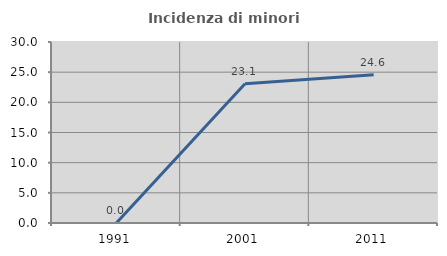
| Category | Incidenza di minori stranieri |
|---|---|
| 1991.0 | 0 |
| 2001.0 | 23.077 |
| 2011.0 | 24.59 |